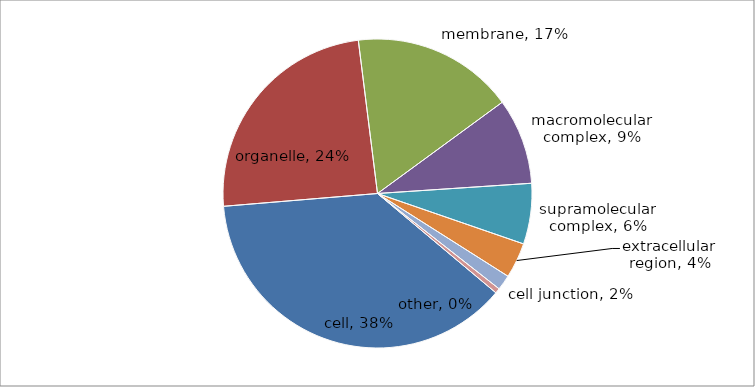
| Category | Series 0 |
|---|---|
| cell | 71 |
| organelle | 46 |
| membrane | 32 |
| macromolecular complex | 17 |
| supramolecular complex | 12 |
| extracellular region | 7 |
| cell junction | 3 |
| other | 1 |